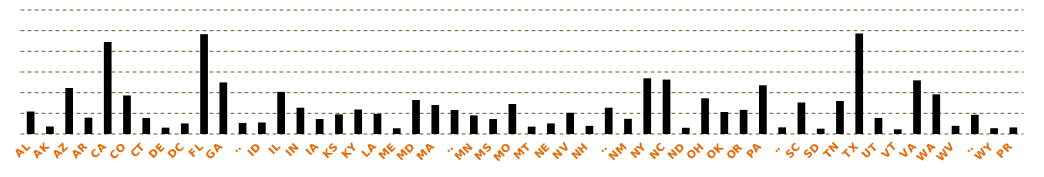
| Category | Series 0 |
|---|---|
| AL | 108723 |
| AK | 36326 |
| AZ | 222725 |
| AR | 79127 |
| CA | 444749 |
| CO | 186366 |
| CT | 77333 |
| DE | 30759 |
| DC | 51244 |
| FL | 482889 |
| GA | 249459 |
| HI | 53581 |
| ID | 55638 |
| IL | 203959 |
| IN | 127353 |
| IA | 72557 |
| KS | 95059 |
| KY | 118443 |
| LA | 97889 |
| ME | 27758 |
| MD | 164484 |
| MA | 140162 |
| MI | 116149 |
| MN | 89872 |
| MS | 72321 |
| MO | 145226 |
| MT | 35630 |
| NE | 51290 |
| NV | 102677 |
| NH | 39367 |
| NJ | 127369 |
| NM | 73605 |
| NY | 269427 |
| NC | 263256 |
| ND | 30100 |
| OH | 172633 |
| OK | 106511 |
| OR | 116700 |
| PA | 235580 |
| RI | 32059 |
| SC | 152441 |
| SD | 25777 |
| TN | 159778 |
| TX | 486558 |
| UT | 77780 |
| VT | 22529 |
| VA | 259507 |
| WA | 191784 |
| WV | 39609 |
| WI | 93065 |
| WY | 28046 |
| PR | 31732 |